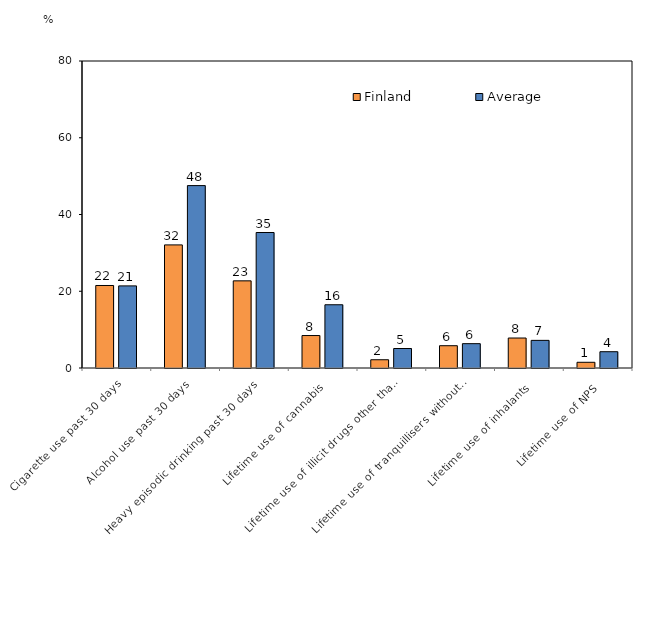
| Category | Finland | Average |
|---|---|---|
| Cigarette use past 30 days | 21.5 | 21.397 |
| Alcohol use past 30 days | 32.08 | 47.531 |
| Heavy episodic drinking past 30 days | 22.71 | 35.309 |
| Lifetime use of cannabis | 8.46 | 16.48 |
| Lifetime use of illicit drugs other than cannabis | 2.15 | 5.079 |
| Lifetime use of tranquillisers without prescription  | 5.81 | 6.34 |
| Lifetime use of inhalants | 7.81 | 7.202 |
| Lifetime use of NPS | 1.49 | 4.246 |